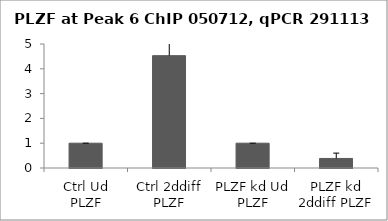
| Category | Series 0 |
|---|---|
| Ctrl Ud PLZF | 1 |
| Ctrl 2ddiff PLZF | 4.53 |
| PLZF kd Ud PLZF | 1 |
| PLZF kd 2ddiff PLZF | 0.384 |